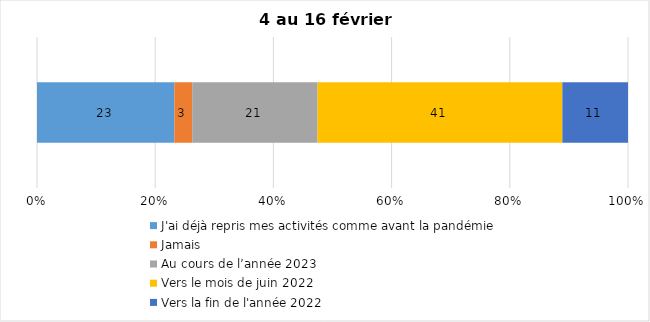
| Category | J'ai déjà repris mes activités comme avant la pandémie | Jamais | Au cours de l’année 2023 | Vers le mois de juin 2022 | Vers la fin de l'année 2022 |
|---|---|---|---|---|---|
| 0 | 23 | 3 | 21 | 41 | 11 |